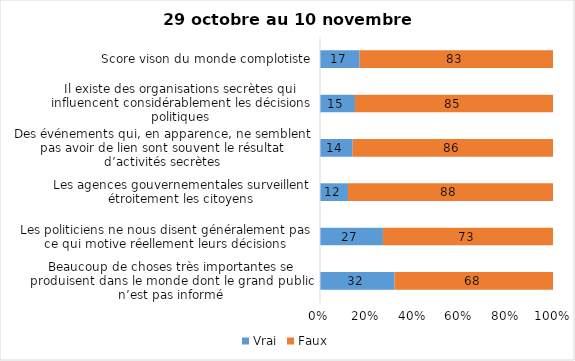
| Category | Vrai | Faux |
|---|---|---|
| Beaucoup de choses très importantes se produisent dans le monde dont le grand public n’est pas informé | 32 | 68 |
| Les politiciens ne nous disent généralement pas ce qui motive réellement leurs décisions | 27 | 73 |
| Les agences gouvernementales surveillent étroitement les citoyens | 12 | 88 |
| Des événements qui, en apparence, ne semblent pas avoir de lien sont souvent le résultat d’activités secrètes | 14 | 86 |
| Il existe des organisations secrètes qui influencent considérablement les décisions politiques | 15 | 85 |
| Score vison du monde complotiste | 17 | 83 |